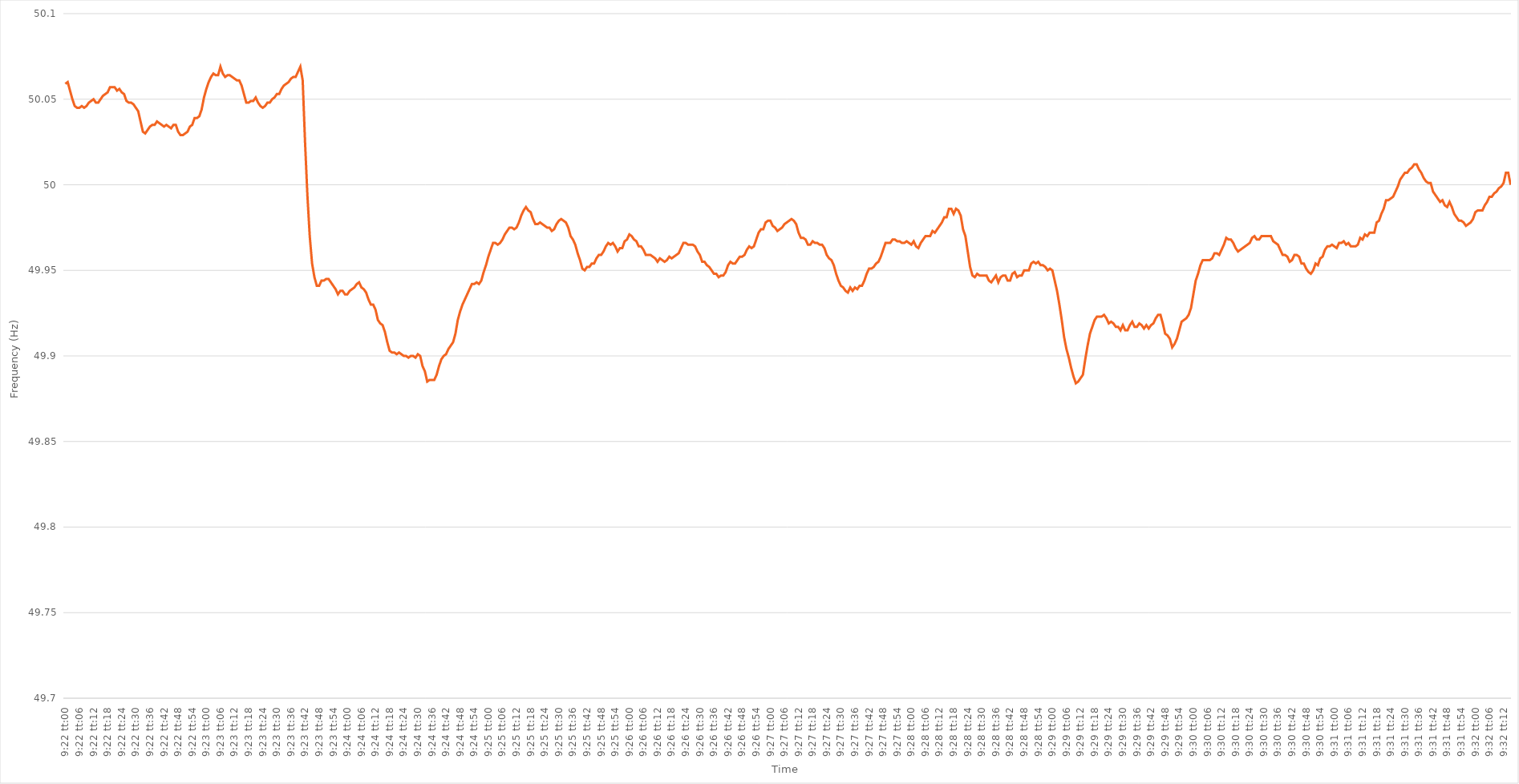
| Category | Series 0 |
|---|---|
| 0.3902777777777778 | 50.059 |
| 0.3902893518518518 | 50.06 |
| 0.39030092592592597 | 50.055 |
| 0.3903125 | 50.05 |
| 0.3903240740740741 | 50.046 |
| 0.39033564814814814 | 50.045 |
| 0.39034722222222223 | 50.045 |
| 0.3903587962962963 | 50.046 |
| 0.3903703703703704 | 50.045 |
| 0.39038194444444446 | 50.046 |
| 0.3903935185185185 | 50.048 |
| 0.3904050925925926 | 50.049 |
| 0.39041666666666663 | 50.05 |
| 0.39042824074074073 | 50.048 |
| 0.39043981481481477 | 50.048 |
| 0.3904513888888889 | 50.05 |
| 0.39046296296296296 | 50.052 |
| 0.39047453703703705 | 50.053 |
| 0.3904861111111111 | 50.054 |
| 0.3904976851851852 | 50.057 |
| 0.3905092592592592 | 50.057 |
| 0.3905208333333334 | 50.057 |
| 0.3905324074074074 | 50.055 |
| 0.3905439814814815 | 50.056 |
| 0.39055555555555554 | 50.054 |
| 0.39056712962962964 | 50.053 |
| 0.3905787037037037 | 50.049 |
| 0.39059027777777783 | 50.048 |
| 0.39060185185185187 | 50.048 |
| 0.39061342592592596 | 50.047 |
| 0.390625 | 50.045 |
| 0.39063657407407404 | 50.043 |
| 0.39064814814814813 | 50.037 |
| 0.39065972222222217 | 50.031 |
| 0.3906712962962963 | 50.03 |
| 0.39068287037037036 | 50.032 |
| 0.39069444444444446 | 50.034 |
| 0.3907060185185185 | 50.035 |
| 0.3907175925925926 | 50.035 |
| 0.3907291666666666 | 50.037 |
| 0.3907407407407408 | 50.036 |
| 0.3907523148148148 | 50.035 |
| 0.3907638888888889 | 50.034 |
| 0.39077546296296295 | 50.035 |
| 0.39078703703703704 | 50.034 |
| 0.3907986111111111 | 50.033 |
| 0.39081018518518523 | 50.035 |
| 0.39082175925925927 | 50.035 |
| 0.39083333333333337 | 50.031 |
| 0.3908449074074074 | 50.029 |
| 0.3908564814814815 | 50.029 |
| 0.39086805555555554 | 50.03 |
| 0.3908796296296296 | 50.031 |
| 0.3908912037037037 | 50.034 |
| 0.39090277777777777 | 50.035 |
| 0.39091435185185186 | 50.039 |
| 0.3909259259259259 | 50.039 |
| 0.3909375 | 50.04 |
| 0.39094907407407403 | 50.044 |
| 0.3909606481481482 | 50.051 |
| 0.3909722222222222 | 50.056 |
| 0.3909837962962963 | 50.06 |
| 0.39099537037037035 | 50.063 |
| 0.39100694444444445 | 50.065 |
| 0.3910185185185185 | 50.064 |
| 0.39103009259259264 | 50.064 |
| 0.3910416666666667 | 50.069 |
| 0.39105324074074077 | 50.065 |
| 0.3910648148148148 | 50.063 |
| 0.3910763888888889 | 50.064 |
| 0.39108796296296294 | 50.064 |
| 0.391099537037037 | 50.063 |
| 0.39111111111111113 | 50.062 |
| 0.39112268518518517 | 50.061 |
| 0.39113425925925926 | 50.061 |
| 0.3911458333333333 | 50.058 |
| 0.3911574074074074 | 50.053 |
| 0.39116898148148144 | 50.048 |
| 0.3911805555555556 | 50.048 |
| 0.3911921296296296 | 50.049 |
| 0.3912037037037037 | 50.049 |
| 0.39121527777777776 | 50.051 |
| 0.39122685185185185 | 50.048 |
| 0.3912384259259259 | 50.046 |
| 0.39125000000000004 | 50.045 |
| 0.3912615740740741 | 50.046 |
| 0.3912731481481482 | 50.048 |
| 0.3912847222222222 | 50.048 |
| 0.3912962962962963 | 50.05 |
| 0.39130787037037035 | 50.051 |
| 0.3913194444444445 | 50.053 |
| 0.39133101851851854 | 50.053 |
| 0.39134259259259263 | 50.056 |
| 0.39135416666666667 | 50.058 |
| 0.3913657407407407 | 50.059 |
| 0.3913773148148148 | 50.06 |
| 0.39138888888888884 | 50.062 |
| 0.391400462962963 | 50.063 |
| 0.39141203703703703 | 50.063 |
| 0.3914236111111111 | 50.066 |
| 0.39143518518518516 | 50.069 |
| 0.39144675925925926 | 50.061 |
| 0.3914583333333333 | 50.025 |
| 0.39146990740740745 | 49.994 |
| 0.3914814814814815 | 49.97 |
| 0.3914930555555556 | 49.954 |
| 0.3915046296296296 | 49.946 |
| 0.3915162037037037 | 49.941 |
| 0.39152777777777775 | 49.941 |
| 0.3915393518518519 | 49.944 |
| 0.39155092592592594 | 49.944 |
| 0.39156250000000004 | 49.945 |
| 0.3915740740740741 | 49.945 |
| 0.3915856481481481 | 49.943 |
| 0.3915972222222222 | 49.941 |
| 0.39160879629629625 | 49.939 |
| 0.3916203703703704 | 49.936 |
| 0.39163194444444444 | 49.938 |
| 0.39164351851851853 | 49.938 |
| 0.39165509259259257 | 49.936 |
| 0.39166666666666666 | 49.936 |
| 0.3916782407407407 | 49.938 |
| 0.39168981481481485 | 49.939 |
| 0.3917013888888889 | 49.94 |
| 0.391712962962963 | 49.942 |
| 0.391724537037037 | 49.943 |
| 0.3917361111111111 | 49.94 |
| 0.39174768518518516 | 49.939 |
| 0.3917592592592593 | 49.937 |
| 0.39177083333333335 | 49.933 |
| 0.39178240740740744 | 49.93 |
| 0.3917939814814815 | 49.93 |
| 0.3918055555555555 | 49.927 |
| 0.3918171296296296 | 49.921 |
| 0.39182870370370365 | 49.919 |
| 0.3918402777777778 | 49.918 |
| 0.39185185185185184 | 49.914 |
| 0.39186342592592593 | 49.908 |
| 0.391875 | 49.903 |
| 0.39188657407407407 | 49.902 |
| 0.3918981481481481 | 49.902 |
| 0.39190972222222226 | 49.901 |
| 0.3919212962962963 | 49.902 |
| 0.3919328703703704 | 49.901 |
| 0.39194444444444443 | 49.9 |
| 0.3919560185185185 | 49.9 |
| 0.39196759259259256 | 49.899 |
| 0.3919791666666667 | 49.9 |
| 0.39199074074074075 | 49.9 |
| 0.39200231481481485 | 49.899 |
| 0.3920138888888889 | 49.901 |
| 0.392025462962963 | 49.9 |
| 0.392037037037037 | 49.894 |
| 0.39204861111111117 | 49.891 |
| 0.3920601851851852 | 49.885 |
| 0.39207175925925924 | 49.886 |
| 0.39208333333333334 | 49.886 |
| 0.3920949074074074 | 49.886 |
| 0.3921064814814815 | 49.889 |
| 0.3921180555555555 | 49.894 |
| 0.39212962962962966 | 49.898 |
| 0.3921412037037037 | 49.9 |
| 0.3921527777777778 | 49.901 |
| 0.39216435185185183 | 49.904 |
| 0.39217592592592593 | 49.906 |
| 0.39218749999999997 | 49.908 |
| 0.3921990740740741 | 49.913 |
| 0.39221064814814816 | 49.921 |
| 0.39222222222222225 | 49.926 |
| 0.3922337962962963 | 49.93 |
| 0.3922453703703704 | 49.933 |
| 0.3922569444444444 | 49.936 |
| 0.39226851851851857 | 49.939 |
| 0.3922800925925926 | 49.942 |
| 0.39229166666666665 | 49.942 |
| 0.39230324074074074 | 49.943 |
| 0.3923148148148148 | 49.942 |
| 0.3923263888888889 | 49.944 |
| 0.3923379629629629 | 49.949 |
| 0.39234953703703707 | 49.953 |
| 0.3923611111111111 | 49.958 |
| 0.3923726851851852 | 49.962 |
| 0.39238425925925924 | 49.966 |
| 0.39239583333333333 | 49.966 |
| 0.39240740740740737 | 49.965 |
| 0.3924189814814815 | 49.966 |
| 0.39243055555555556 | 49.968 |
| 0.39244212962962965 | 49.971 |
| 0.3924537037037037 | 49.973 |
| 0.3924652777777778 | 49.975 |
| 0.3924768518518518 | 49.975 |
| 0.392488425925926 | 49.974 |
| 0.3925 | 49.975 |
| 0.39251157407407405 | 49.978 |
| 0.39252314814814815 | 49.982 |
| 0.3925347222222222 | 49.985 |
| 0.3925462962962963 | 49.987 |
| 0.3925578703703703 | 49.985 |
| 0.39256944444444447 | 49.984 |
| 0.3925810185185185 | 49.98 |
| 0.3925925925925926 | 49.977 |
| 0.39260416666666664 | 49.977 |
| 0.39261574074074074 | 49.978 |
| 0.3926273148148148 | 49.977 |
| 0.3926388888888889 | 49.976 |
| 0.39265046296296297 | 49.975 |
| 0.39266203703703706 | 49.975 |
| 0.3926736111111111 | 49.973 |
| 0.3926851851851852 | 49.974 |
| 0.39269675925925923 | 49.977 |
| 0.3927083333333334 | 49.979 |
| 0.3927199074074074 | 49.98 |
| 0.3927314814814815 | 49.979 |
| 0.39274305555555555 | 49.978 |
| 0.39275462962962965 | 49.975 |
| 0.3927662037037037 | 49.97 |
| 0.3927777777777777 | 49.968 |
| 0.3927893518518519 | 49.965 |
| 0.3928009259259259 | 49.96 |
| 0.3928125 | 49.956 |
| 0.39282407407407405 | 49.951 |
| 0.39283564814814814 | 49.95 |
| 0.3928472222222222 | 49.952 |
| 0.39285879629629633 | 49.952 |
| 0.39287037037037037 | 49.954 |
| 0.39288194444444446 | 49.954 |
| 0.3928935185185185 | 49.957 |
| 0.3929050925925926 | 49.959 |
| 0.39291666666666664 | 49.959 |
| 0.3929282407407408 | 49.961 |
| 0.3929398148148148 | 49.964 |
| 0.3929513888888889 | 49.966 |
| 0.39296296296296296 | 49.965 |
| 0.39297453703703705 | 49.966 |
| 0.3929861111111111 | 49.964 |
| 0.39299768518518513 | 49.961 |
| 0.3930092592592593 | 49.963 |
| 0.3930208333333333 | 49.963 |
| 0.3930324074074074 | 49.967 |
| 0.39304398148148145 | 49.968 |
| 0.39305555555555555 | 49.971 |
| 0.3930671296296296 | 49.97 |
| 0.39307870370370374 | 49.968 |
| 0.3930902777777778 | 49.967 |
| 0.39310185185185187 | 49.964 |
| 0.3931134259259259 | 49.964 |
| 0.393125 | 49.962 |
| 0.39313657407407404 | 49.959 |
| 0.3931481481481482 | 49.959 |
| 0.39315972222222223 | 49.959 |
| 0.3931712962962963 | 49.958 |
| 0.39318287037037036 | 49.957 |
| 0.39319444444444446 | 49.955 |
| 0.3932060185185185 | 49.957 |
| 0.39321759259259265 | 49.956 |
| 0.3932291666666667 | 49.955 |
| 0.3932407407407407 | 49.956 |
| 0.3932523148148148 | 49.958 |
| 0.39326388888888886 | 49.957 |
| 0.39327546296296295 | 49.958 |
| 0.393287037037037 | 49.959 |
| 0.39329861111111114 | 49.96 |
| 0.3933101851851852 | 49.963 |
| 0.3933217592592593 | 49.966 |
| 0.3933333333333333 | 49.966 |
| 0.3933449074074074 | 49.965 |
| 0.39335648148148145 | 49.965 |
| 0.3933680555555556 | 49.965 |
| 0.39337962962962963 | 49.964 |
| 0.39339120370370373 | 49.961 |
| 0.39340277777777777 | 49.959 |
| 0.39341435185185186 | 49.955 |
| 0.3934259259259259 | 49.955 |
| 0.39343750000000005 | 49.953 |
| 0.3934490740740741 | 49.952 |
| 0.3934606481481482 | 49.95 |
| 0.3934722222222222 | 49.948 |
| 0.39348379629629626 | 49.948 |
| 0.39349537037037036 | 49.946 |
| 0.3935069444444444 | 49.947 |
| 0.39351851851851855 | 49.947 |
| 0.3935300925925926 | 49.949 |
| 0.3935416666666667 | 49.953 |
| 0.3935532407407407 | 49.955 |
| 0.3935648148148148 | 49.954 |
| 0.39357638888888885 | 49.954 |
| 0.393587962962963 | 49.956 |
| 0.39359953703703704 | 49.958 |
| 0.39361111111111113 | 49.958 |
| 0.3936226851851852 | 49.959 |
| 0.39363425925925927 | 49.962 |
| 0.3936458333333333 | 49.964 |
| 0.39365740740740746 | 49.963 |
| 0.3936689814814815 | 49.964 |
| 0.3936805555555556 | 49.968 |
| 0.39369212962962963 | 49.972 |
| 0.39370370370370367 | 49.974 |
| 0.39371527777777776 | 49.974 |
| 0.3937268518518518 | 49.978 |
| 0.39373842592592595 | 49.979 |
| 0.39375 | 49.979 |
| 0.3937615740740741 | 49.976 |
| 0.3937731481481481 | 49.975 |
| 0.3937847222222222 | 49.973 |
| 0.39379629629629626 | 49.974 |
| 0.3938078703703704 | 49.975 |
| 0.39381944444444444 | 49.977 |
| 0.39383101851851854 | 49.978 |
| 0.3938425925925926 | 49.979 |
| 0.39385416666666667 | 49.98 |
| 0.3938657407407407 | 49.979 |
| 0.39387731481481486 | 49.977 |
| 0.3938888888888889 | 49.972 |
| 0.393900462962963 | 49.969 |
| 0.39391203703703703 | 49.969 |
| 0.3939236111111111 | 49.968 |
| 0.39393518518518517 | 49.965 |
| 0.3939467592592593 | 49.965 |
| 0.39395833333333335 | 49.967 |
| 0.3939699074074074 | 49.966 |
| 0.3939814814814815 | 49.966 |
| 0.3939930555555555 | 49.965 |
| 0.3940046296296296 | 49.965 |
| 0.39401620370370366 | 49.963 |
| 0.3940277777777778 | 49.959 |
| 0.39403935185185185 | 49.957 |
| 0.39405092592592594 | 49.956 |
| 0.3940625 | 49.953 |
| 0.3940740740740741 | 49.948 |
| 0.3940856481481481 | 49.944 |
| 0.39409722222222227 | 49.941 |
| 0.3941087962962963 | 49.94 |
| 0.3941203703703704 | 49.938 |
| 0.39413194444444444 | 49.937 |
| 0.39414351851851853 | 49.94 |
| 0.39415509259259257 | 49.938 |
| 0.3941666666666667 | 49.94 |
| 0.39417824074074076 | 49.939 |
| 0.3941898148148148 | 49.941 |
| 0.3942013888888889 | 49.941 |
| 0.39421296296296293 | 49.944 |
| 0.394224537037037 | 49.948 |
| 0.39423611111111106 | 49.951 |
| 0.3942476851851852 | 49.951 |
| 0.39425925925925925 | 49.952 |
| 0.39427083333333335 | 49.954 |
| 0.3942824074074074 | 49.955 |
| 0.3942939814814815 | 49.958 |
| 0.3943055555555555 | 49.962 |
| 0.39431712962962967 | 49.966 |
| 0.3943287037037037 | 49.966 |
| 0.3943402777777778 | 49.966 |
| 0.39435185185185184 | 49.968 |
| 0.39436342592592594 | 49.968 |
| 0.394375 | 49.967 |
| 0.3943865740740741 | 49.967 |
| 0.39439814814814816 | 49.966 |
| 0.3944097222222222 | 49.966 |
| 0.3944212962962963 | 49.967 |
| 0.39443287037037034 | 49.966 |
| 0.39444444444444443 | 49.965 |
| 0.39445601851851847 | 49.967 |
| 0.3944675925925926 | 49.964 |
| 0.39447916666666666 | 49.963 |
| 0.39449074074074075 | 49.966 |
| 0.3945023148148148 | 49.968 |
| 0.3945138888888889 | 49.97 |
| 0.3945254629629629 | 49.97 |
| 0.3945370370370371 | 49.97 |
| 0.3945486111111111 | 49.973 |
| 0.3945601851851852 | 49.972 |
| 0.39457175925925925 | 49.974 |
| 0.39458333333333334 | 49.976 |
| 0.3945949074074074 | 49.978 |
| 0.39460648148148153 | 49.981 |
| 0.39461805555555557 | 49.981 |
| 0.39462962962962966 | 49.986 |
| 0.3946412037037037 | 49.986 |
| 0.3946527777777778 | 49.983 |
| 0.39466435185185184 | 49.986 |
| 0.3946759259259259 | 49.985 |
| 0.3946875 | 49.982 |
| 0.39469907407407406 | 49.974 |
| 0.39471064814814816 | 49.97 |
| 0.3947222222222222 | 49.961 |
| 0.3947337962962963 | 49.952 |
| 0.39474537037037033 | 49.947 |
| 0.3947569444444445 | 49.946 |
| 0.3947685185185185 | 49.948 |
| 0.3947800925925926 | 49.947 |
| 0.39479166666666665 | 49.947 |
| 0.39480324074074075 | 49.947 |
| 0.3948148148148148 | 49.947 |
| 0.39482638888888894 | 49.944 |
| 0.394837962962963 | 49.943 |
| 0.39484953703703707 | 49.945 |
| 0.3948611111111111 | 49.947 |
| 0.3948726851851852 | 49.943 |
| 0.39488425925925924 | 49.946 |
| 0.3948958333333333 | 49.947 |
| 0.39490740740740743 | 49.947 |
| 0.39491898148148147 | 49.944 |
| 0.39493055555555556 | 49.944 |
| 0.3949421296296296 | 49.948 |
| 0.3949537037037037 | 49.949 |
| 0.39496527777777773 | 49.946 |
| 0.3949768518518519 | 49.947 |
| 0.3949884259259259 | 49.947 |
| 0.395 | 49.95 |
| 0.39501157407407406 | 49.95 |
| 0.39502314814814815 | 49.95 |
| 0.3950347222222222 | 49.954 |
| 0.39504629629629634 | 49.955 |
| 0.3950578703703704 | 49.954 |
| 0.3950694444444445 | 49.955 |
| 0.3950810185185185 | 49.953 |
| 0.3950925925925926 | 49.953 |
| 0.39510416666666665 | 49.952 |
| 0.3951157407407407 | 49.95 |
| 0.39512731481481483 | 49.951 |
| 0.3951388888888889 | 49.95 |
| 0.39515046296296297 | 49.944 |
| 0.395162037037037 | 49.938 |
| 0.3951736111111111 | 49.93 |
| 0.39518518518518514 | 49.921 |
| 0.3951967592592593 | 49.911 |
| 0.39520833333333333 | 49.904 |
| 0.3952199074074074 | 49.899 |
| 0.39523148148148146 | 49.893 |
| 0.39524305555555556 | 49.888 |
| 0.3952546296296296 | 49.884 |
| 0.39526620370370374 | 49.885 |
| 0.3952777777777778 | 49.887 |
| 0.3952893518518519 | 49.889 |
| 0.3953009259259259 | 49.898 |
| 0.3953125 | 49.906 |
| 0.39532407407407405 | 49.913 |
| 0.3953356481481482 | 49.917 |
| 0.39534722222222224 | 49.921 |
| 0.39535879629629633 | 49.923 |
| 0.39537037037037037 | 49.923 |
| 0.3953819444444444 | 49.923 |
| 0.3953935185185185 | 49.924 |
| 0.39540509259259254 | 49.922 |
| 0.3954166666666667 | 49.919 |
| 0.39542824074074073 | 49.92 |
| 0.3954398148148148 | 49.919 |
| 0.39545138888888887 | 49.917 |
| 0.39546296296296296 | 49.917 |
| 0.395474537037037 | 49.915 |
| 0.39548611111111115 | 49.918 |
| 0.3954976851851852 | 49.915 |
| 0.3955092592592593 | 49.915 |
| 0.3955208333333333 | 49.918 |
| 0.3955324074074074 | 49.92 |
| 0.39554398148148145 | 49.917 |
| 0.3955555555555556 | 49.917 |
| 0.39556712962962964 | 49.919 |
| 0.39557870370370374 | 49.918 |
| 0.3955902777777778 | 49.916 |
| 0.3956018518518518 | 49.918 |
| 0.3956134259259259 | 49.916 |
| 0.39562499999999995 | 49.918 |
| 0.3956365740740741 | 49.919 |
| 0.39564814814814814 | 49.922 |
| 0.39565972222222223 | 49.924 |
| 0.39567129629629627 | 49.924 |
| 0.39568287037037037 | 49.919 |
| 0.3956944444444444 | 49.913 |
| 0.39570601851851855 | 49.912 |
| 0.3957175925925926 | 49.91 |
| 0.3957291666666667 | 49.905 |
| 0.3957407407407407 | 49.907 |
| 0.3957523148148148 | 49.91 |
| 0.39576388888888886 | 49.915 |
| 0.395775462962963 | 49.92 |
| 0.39578703703703705 | 49.921 |
| 0.39579861111111114 | 49.922 |
| 0.3958101851851852 | 49.924 |
| 0.3958217592592593 | 49.928 |
| 0.3958333333333333 | 49.936 |
| 0.39584490740740735 | 49.944 |
| 0.3958564814814815 | 49.948 |
| 0.39586805555555554 | 49.953 |
| 0.39587962962962964 | 49.956 |
| 0.3958912037037037 | 49.956 |
| 0.39590277777777777 | 49.956 |
| 0.3959143518518518 | 49.956 |
| 0.39592592592592596 | 49.957 |
| 0.3959375 | 49.96 |
| 0.3959490740740741 | 49.96 |
| 0.39596064814814813 | 49.959 |
| 0.3959722222222222 | 49.962 |
| 0.39598379629629626 | 49.965 |
| 0.3959953703703704 | 49.969 |
| 0.39600694444444445 | 49.968 |
| 0.39601851851851855 | 49.968 |
| 0.3960300925925926 | 49.966 |
| 0.3960416666666667 | 49.963 |
| 0.3960532407407407 | 49.961 |
| 0.39606481481481487 | 49.962 |
| 0.3960763888888889 | 49.963 |
| 0.39608796296296295 | 49.964 |
| 0.39609953703703704 | 49.965 |
| 0.3961111111111111 | 49.966 |
| 0.3961226851851852 | 49.969 |
| 0.3961342592592592 | 49.97 |
| 0.39614583333333336 | 49.968 |
| 0.3961574074074074 | 49.968 |
| 0.3961689814814815 | 49.97 |
| 0.39618055555555554 | 49.97 |
| 0.39619212962962963 | 49.97 |
| 0.39620370370370367 | 49.97 |
| 0.3962152777777778 | 49.97 |
| 0.39622685185185186 | 49.967 |
| 0.39623842592592595 | 49.966 |
| 0.39625 | 49.965 |
| 0.3962615740740741 | 49.962 |
| 0.3962731481481481 | 49.959 |
| 0.3962847222222223 | 49.959 |
| 0.3962962962962963 | 49.958 |
| 0.39630787037037035 | 49.955 |
| 0.39631944444444445 | 49.956 |
| 0.3963310185185185 | 49.959 |
| 0.3963425925925926 | 49.959 |
| 0.3963541666666666 | 49.958 |
| 0.39636574074074077 | 49.954 |
| 0.3963773148148148 | 49.954 |
| 0.3963888888888889 | 49.951 |
| 0.39640046296296294 | 49.949 |
| 0.39641203703703703 | 49.948 |
| 0.3964236111111111 | 49.95 |
| 0.3964351851851852 | 49.954 |
| 0.39644675925925926 | 49.953 |
| 0.39645833333333336 | 49.957 |
| 0.3964699074074074 | 49.958 |
| 0.3964814814814815 | 49.962 |
| 0.39649305555555553 | 49.964 |
| 0.3965046296296297 | 49.964 |
| 0.3965162037037037 | 49.965 |
| 0.3965277777777778 | 49.964 |
| 0.39653935185185185 | 49.963 |
| 0.39655092592592595 | 49.966 |
| 0.3965625 | 49.966 |
| 0.396574074074074 | 49.967 |
| 0.3965856481481482 | 49.965 |
| 0.3965972222222222 | 49.966 |
| 0.3966087962962963 | 49.964 |
| 0.39662037037037035 | 49.964 |
| 0.39663194444444444 | 49.964 |
| 0.3966435185185185 | 49.965 |
| 0.39665509259259263 | 49.969 |
| 0.39666666666666667 | 49.968 |
| 0.39667824074074076 | 49.971 |
| 0.3966898148148148 | 49.97 |
| 0.3967013888888889 | 49.972 |
| 0.39671296296296293 | 49.972 |
| 0.3967245370370371 | 49.972 |
| 0.3967361111111111 | 49.978 |
| 0.3967476851851852 | 49.979 |
| 0.39675925925925926 | 49.983 |
| 0.39677083333333335 | 49.986 |
| 0.3967824074074074 | 49.991 |
| 0.39679398148148143 | 49.991 |
| 0.3968055555555556 | 49.992 |
| 0.3968171296296296 | 49.993 |
| 0.3968287037037037 | 49.996 |
| 0.39684027777777775 | 49.999 |
| 0.39685185185185184 | 50.003 |
| 0.3968634259259259 | 50.005 |
| 0.39687500000000003 | 50.007 |
| 0.39688657407407407 | 50.007 |
| 0.39689814814814817 | 50.009 |
| 0.3969097222222222 | 50.01 |
| 0.3969212962962963 | 50.012 |
| 0.39693287037037034 | 50.012 |
| 0.3969444444444445 | 50.009 |
| 0.3969560185185185 | 50.007 |
| 0.3969675925925926 | 50.004 |
| 0.39697916666666666 | 50.002 |
| 0.39699074074074076 | 50.001 |
| 0.3970023148148148 | 50.001 |
| 0.39701388888888883 | 49.996 |
| 0.397025462962963 | 49.994 |
| 0.397037037037037 | 49.992 |
| 0.3970486111111111 | 49.99 |
| 0.39706018518518515 | 49.991 |
| 0.39707175925925925 | 49.988 |
| 0.3970833333333333 | 49.987 |
| 0.39709490740740744 | 49.99 |
| 0.3971064814814815 | 49.987 |
| 0.39711805555555557 | 49.983 |
| 0.3971296296296296 | 49.981 |
| 0.3971412037037037 | 49.979 |
| 0.39715277777777774 | 49.979 |
| 0.3971643518518519 | 49.978 |
| 0.39717592592592593 | 49.976 |
| 0.3971875 | 49.977 |
| 0.39719907407407407 | 49.978 |
| 0.39721064814814816 | 49.98 |
| 0.3972222222222222 | 49.984 |
| 0.39723379629629635 | 49.985 |
| 0.3972453703703704 | 49.985 |
| 0.3972569444444444 | 49.985 |
| 0.3972685185185185 | 49.988 |
| 0.39728009259259256 | 49.99 |
| 0.39729166666666665 | 49.993 |
| 0.3973032407407407 | 49.993 |
| 0.39731481481481484 | 49.995 |
| 0.3973263888888889 | 49.996 |
| 0.397337962962963 | 49.998 |
| 0.397349537037037 | 49.999 |
| 0.3973611111111111 | 50.001 |
| 0.39737268518518515 | 50.007 |
| 0.3973842592592593 | 50.007 |
| 0.39739583333333334 | 50 |